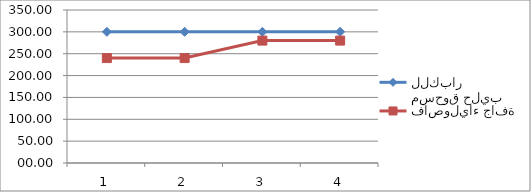
| Category | مسحوق حليب للكبار | فاصولياء جافة |
|---|---|---|
| 0 | 300 | 240 |
| 1 | 300 | 240 |
| 2 | 300 | 280 |
| 3 | 300 | 280 |